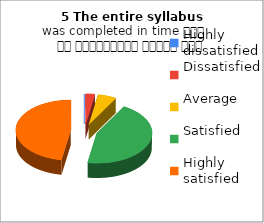
| Category | 5 The entire syllabus
was completed in time समय पर पाठ्यक्रम पूर्ण हुआ |
|---|---|
| Highly dissatisfied | 0 |
| Dissatisfied | 2 |
| Average | 4 |
| Satisfied | 33 |
| Highly satisfied | 35 |